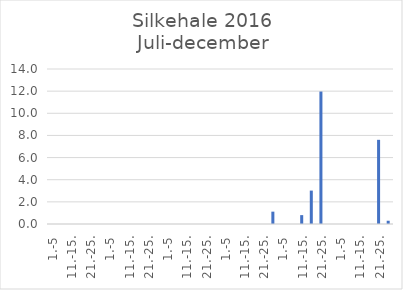
| Category | Series 0 |
|---|---|
| 1.-5 | 0 |
| 6.-10. | 0 |
| 11.-15. | 0 |
| 16.-20. | 0 |
| 21.-25. | 0 |
| 26.-31. | 0 |
| 1.-5 | 0 |
| 6.-10. | 0 |
| 11.-15. | 0 |
| 16.-20. | 0 |
| 21.-25. | 0 |
| 26.-31. | 0 |
| 1.-5 | 0 |
| 6.-10. | 0 |
| 11.-15. | 0 |
| 16.-20. | 0 |
| 21.-25. | 0 |
| 26.-30. | 0 |
| 1.-5 | 0 |
| 6.-10. | 0 |
| 11.-15. | 0 |
| 16.-20. | 0 |
| 21.-25. | 0 |
| 26.-31. | 1.115 |
| 1.-5 | 0 |
| 6.-10. | 0 |
| 11.-15. | 0.802 |
| 16.-20. | 3.017 |
| 21.-25. | 11.963 |
| 26.-30. | 0 |
| 1.-5 | 0 |
| 6.-10. | 0 |
| 11.-15. | 0 |
| 16.-20. | 0 |
| 21.-25. | 7.603 |
| 26.-31. | 0.295 |